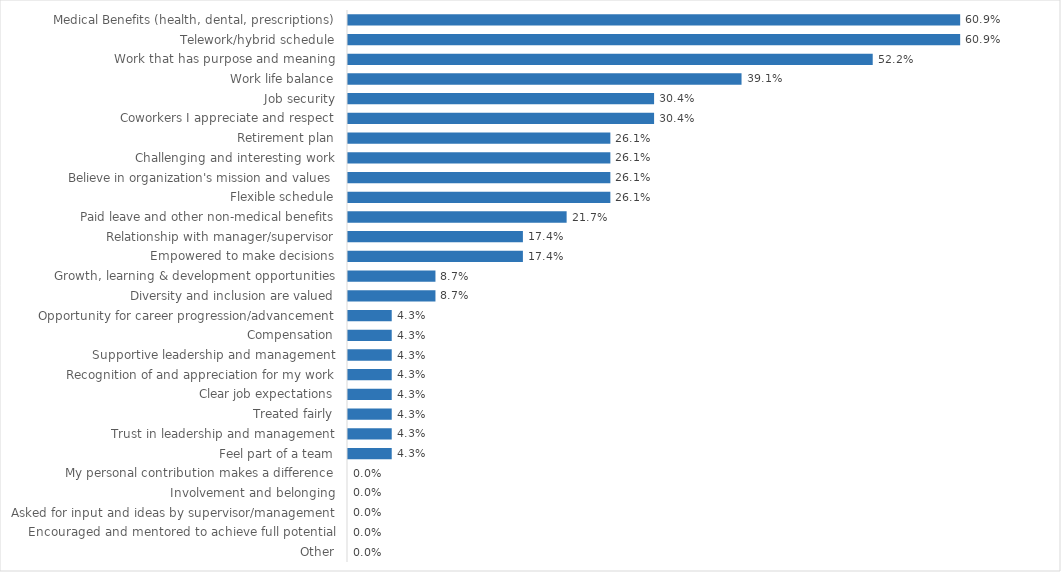
| Category | Agency of Natural Resources - CO |
|---|---|
| Medical Benefits (health, dental, prescriptions) | 0.609 |
| Telework/hybrid schedule | 0.609 |
| Work that has purpose and meaning | 0.522 |
| Work life balance | 0.391 |
| Job security | 0.304 |
| Coworkers I appreciate and respect | 0.304 |
| Retirement plan | 0.261 |
| Challenging and interesting work | 0.261 |
| Believe in organization's mission and values | 0.261 |
| Flexible schedule | 0.261 |
| Paid leave and other non-medical benefits | 0.217 |
| Relationship with manager/supervisor | 0.174 |
| Empowered to make decisions | 0.174 |
| Growth, learning & development opportunities | 0.087 |
| Diversity and inclusion are valued | 0.087 |
| Opportunity for career progression/advancement | 0.043 |
| Compensation | 0.043 |
| Supportive leadership and management | 0.043 |
| Recognition of and appreciation for my work | 0.043 |
| Clear job expectations | 0.043 |
| Treated fairly | 0.043 |
| Trust in leadership and management | 0.043 |
| Feel part of a team | 0.043 |
| My personal contribution makes a difference | 0 |
| Involvement and belonging | 0 |
| Asked for input and ideas by supervisor/management | 0 |
| Encouraged and mentored to achieve full potential | 0 |
| Other | 0 |